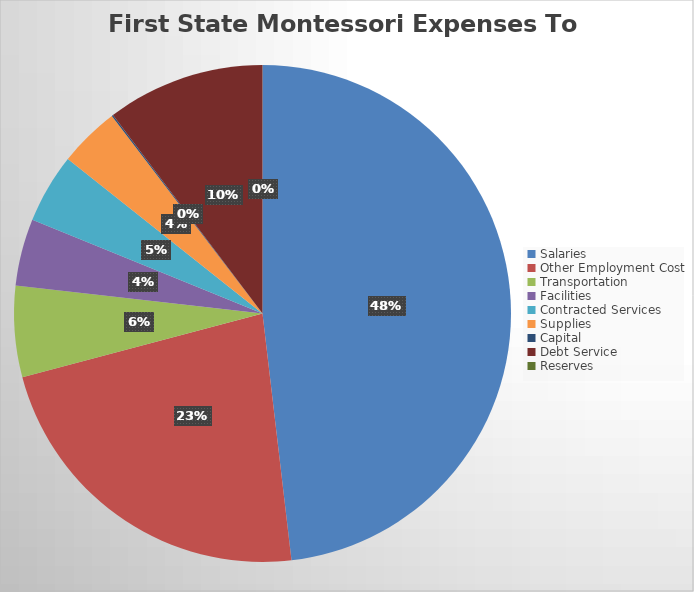
| Category | Series 0 |
|---|---|
| Salaries | 3579956.43 |
| Other Employment Cost | 1689971.44 |
| Transportation | 441359.52 |
| Facilities | 323506.08 |
| Contracted Services | 336665.57 |
| Supplies | 294278.29 |
| Capital | 6645.6 |
| Debt Service | 764340.32 |
| Reserves | 0 |